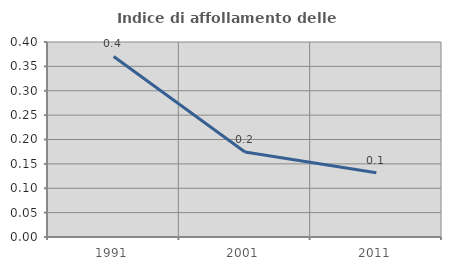
| Category | Indice di affollamento delle abitazioni  |
|---|---|
| 1991.0 | 0.37 |
| 2001.0 | 0.174 |
| 2011.0 | 0.132 |